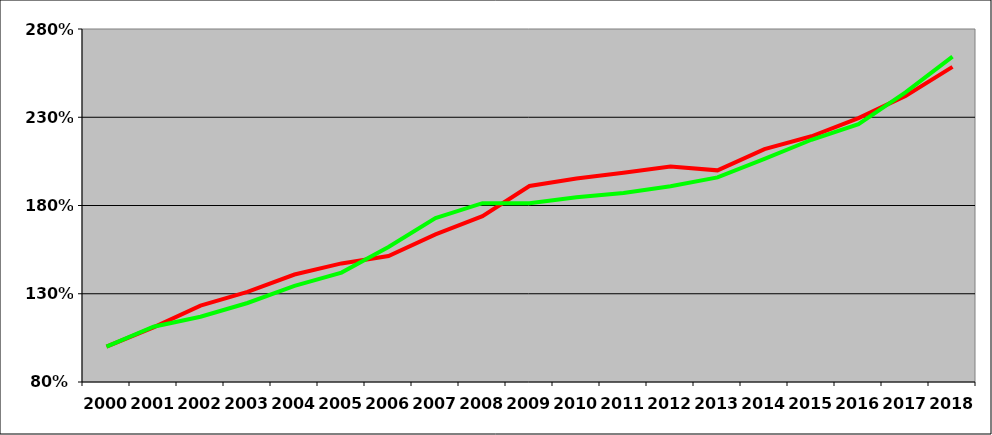
| Category | Náklady - kumulovaný nárůst (2000 = 100 %) | Příjmy - kumulovaný nárůst (2000 = 100 %) |
|---|---|---|
| 2000 | 1 | 1 |
| 2001 | 1.109 | 1.113 |
| 2002 | 1.233 | 1.17 |
| 2003 | 1.311 | 1.248 |
| 2004 | 1.409 | 1.344 |
| 2005 | 1.472 | 1.42 |
| 2006 | 1.514 | 1.565 |
| 2007 | 1.636 | 1.729 |
| 2008 | 1.739 | 1.813 |
| 2009 | 1.91 | 1.812 |
| 2010 | 1.953 | 1.846 |
| 2011 | 1.986 | 1.871 |
| 2012 | 2.021 | 1.909 |
| 2013 | 1.999 | 1.959 |
| 2014 | 2.12 | 2.064 |
| 2015 | 2.192 | 2.172 |
| 2016 | 2.295 | 2.261 |
| 2017 | 2.421 | 2.441 |
| 2018 | 2.585 | 2.644 |